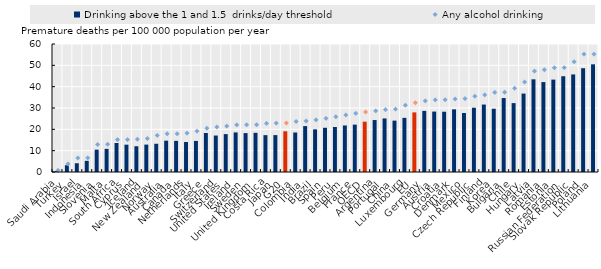
| Category | Drinking above the 1 and 1.5  drinks/day threshold |
|---|---|
| Saudi Arabia | 0.425 |
| Turkey | 3.18 |
| Israel | 4.104 |
| Indonesia | 5.229 |
| Slovenia | 10.48 |
| Malta | 10.852 |
| South Africa | 13.605 |
| Cyprus | 12.81 |
| Iceland | 12.079 |
| New Zealand | 12.841 |
| Norway | 13.234 |
| Australia | 14.691 |
| Canada | 14.602 |
| Netherlands | 14.055 |
| Italy | 14.567 |
| Greece | 18.29 |
| Switzerland | 17.092 |
| United States | 17.763 |
| Ireland | 18.556 |
| Sweden | 18.242 |
| United Kingdom | 18.366 |
| Costa Rica | 17.279 |
| Japan | 17.296 |
| G20 | 19.093 |
| Colombia | 18.522 |
| India | 21.525 |
| Brazil | 20.004 |
| Spain | 20.73 |
| Peru | 21.096 |
| Belgium | 21.807 |
| France | 22.21 |
| OECD | 23.593 |
| Argentina | 24.359 |
| Portugal | 25.103 |
| China | 24.079 |
| Luxembourg | 25.37 |
| EU | 27.949 |
| Germany | 28.645 |
| Austria | 28.326 |
| Croatia | 28.255 |
| Denmark | 29.373 |
| Mexico | 27.671 |
| Czech Republic | 30.13 |
| Finland | 31.617 |
| Korea | 29.658 |
| Bulgaria | 34.667 |
| Chile | 32.292 |
| Hungary | 36.77 |
| Latvia | 43.445 |
| Romania | 42.147 |
| Estonia | 43.308 |
| Russian Federation | 44.896 |
| Slovak Republic | 45.733 |
| Poland | 48.647 |
| Lithuania | 50.476 |